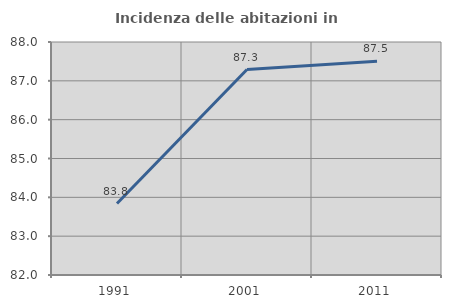
| Category | Incidenza delle abitazioni in proprietà  |
|---|---|
| 1991.0 | 83.841 |
| 2001.0 | 87.291 |
| 2011.0 | 87.507 |